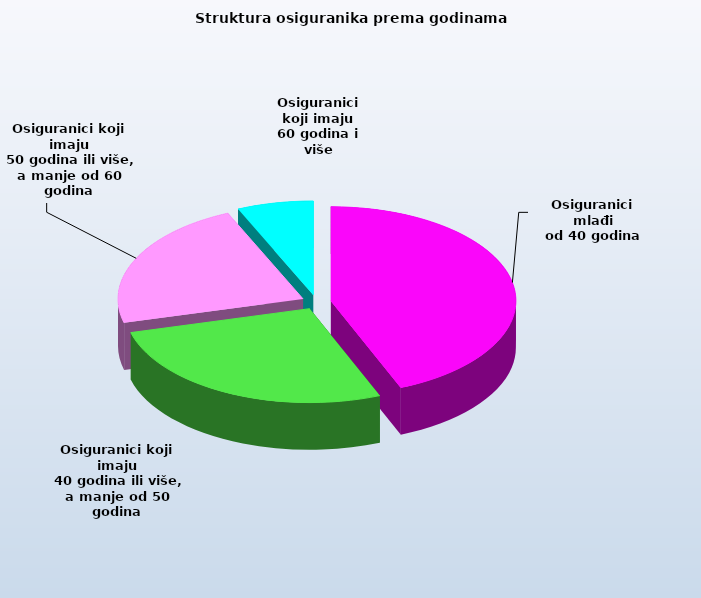
| Category | Series 0 |
|---|---|
| Osiguranici mlađi
od 40 godina | 680964 |
| Osiguranici koji imaju
 40 godina ili više, a manje od 50 godina | 420737 |
| Osiguranici koji imaju
 50 godina ili više, a manje od 60 godina | 348572 |
| Osiguranici koji imaju
60 godina i više | 103606 |